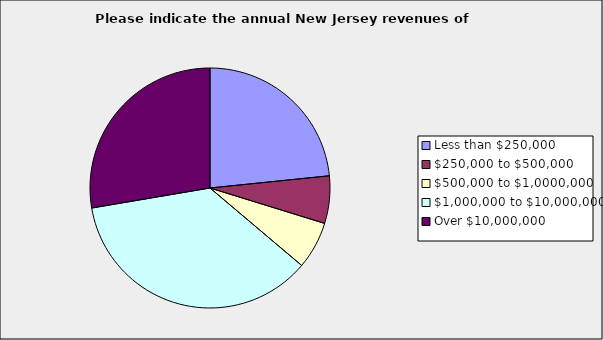
| Category | Series 0 |
|---|---|
| Less than $250,000 | 0.234 |
| $250,000 to $500,000 | 0.064 |
| $500,000 to $1,0000,000 | 0.064 |
| $1,000,000 to $10,000,000 | 0.362 |
| Over $10,000,000 | 0.277 |